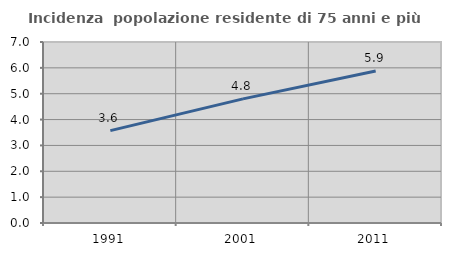
| Category | Incidenza  popolazione residente di 75 anni e più |
|---|---|
| 1991.0 | 3.571 |
| 2001.0 | 4.8 |
| 2011.0 | 5.88 |